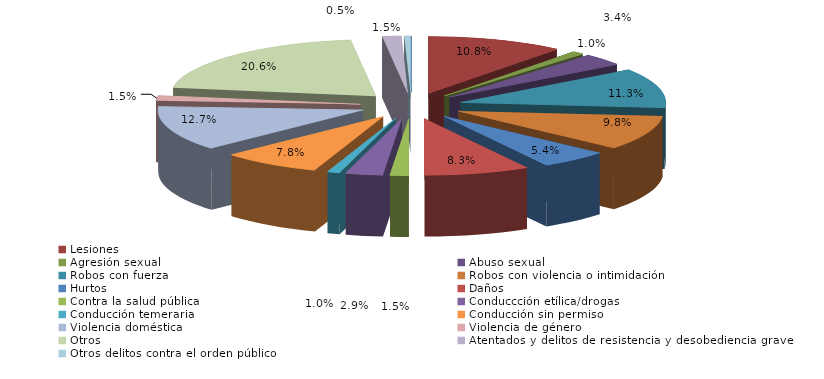
| Category | Series 0 |
|---|---|
| Homicidio/Asesinato dolosos | 0 |
| Lesiones | 22 |
| Agresión sexual | 2 |
| Abuso sexual | 7 |
| Robos con fuerza | 23 |
| Robos con violencia o intimidación | 20 |
| Hurtos | 11 |
| Daños | 17 |
| Contra la salud pública | 3 |
| Conduccción etílica/drogas | 6 |
| Conducción temeraria | 2 |
| Conducción sin permiso | 16 |
| Violencia doméstica | 26 |
| Violencia de género | 3 |
| Otros | 42 |
| Atentados y delitos de resistencia y desobediencia grave | 3 |
| Otros delitos contra el orden público | 1 |